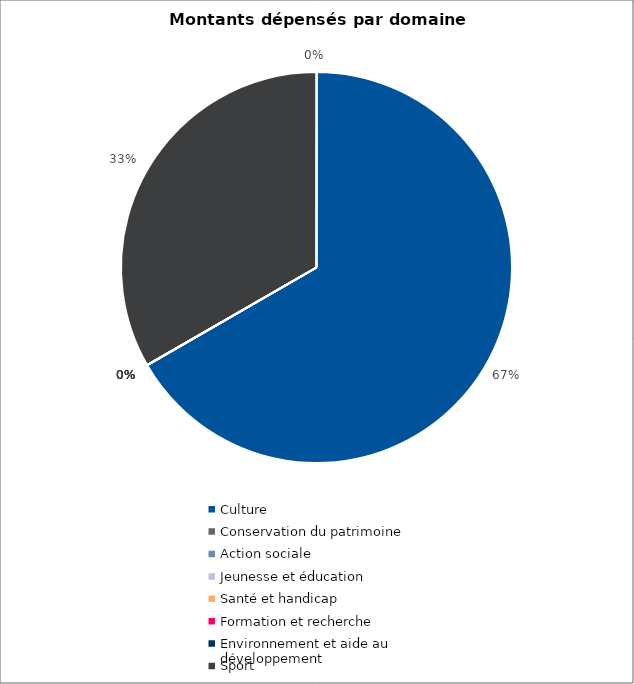
| Category | Series 0 |
|---|---|
| Culture | 500000 |
| Conservation du patrimoine | 0 |
| Action sociale | 0 |
| Jeunesse et éducation | 0 |
| Santé et handicap | 0 |
| Formation et recherche | 0 |
| Environnement et aide au
développement | 0 |
| Sport | 250000 |
| Autres projets d’utilité publique | 0 |